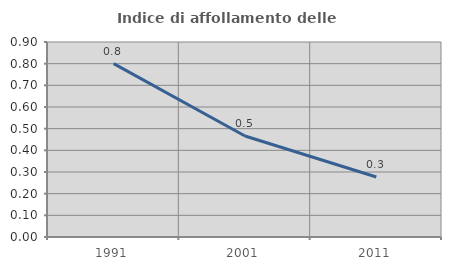
| Category | Indice di affollamento delle abitazioni  |
|---|---|
| 1991.0 | 0.8 |
| 2001.0 | 0.466 |
| 2011.0 | 0.277 |